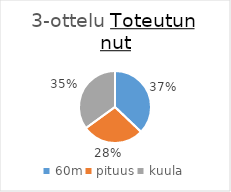
| Category | Series 0 |
|---|---|
| 60m | 382 |
| pituus | 287 |
| kuula | 360 |